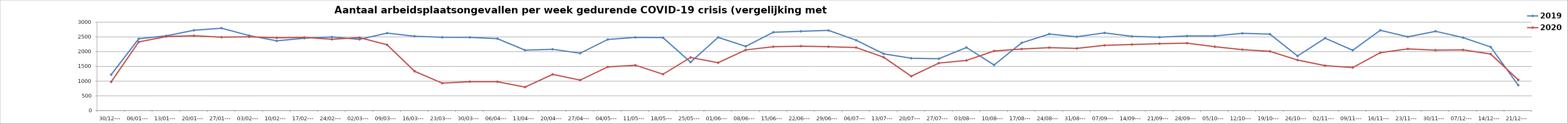
| Category | 2019 | 2020 |
|---|---|---|
| 30/12--- | 1219 | 976 |
| 06/01--- | 2438 | 2330 |
| 13/01--- | 2537 | 2512 |
| 20/01--- | 2725 | 2541 |
| 27/01--- | 2798 | 2492 |
| 03/02--- | 2547 | 2506 |
| 10/02--- | 2366 | 2472 |
| 17/02--- | 2457 | 2483 |
| 24/02--- | 2498 | 2420 |
| 02/03--- | 2418 | 2476 |
| 09/03--- | 2629 | 2234 |
| 16/03--- | 2525 | 1334 |
| 23/03--- | 2487 | 930 |
| 30/03--- | 2486 | 982 |
| 06/04--- | 2442 | 980 |
| 13/04--- | 2051 | 798 |
| 20/04--- | 2081 | 1229 |
| 27/04--- | 1947 | 1034 |
| 04/05--- | 2414 | 1482 |
| 11/05--- | 2485 | 1540 |
| 18/05--- | 2477 | 1234 |
| 25/05--- | 1644 | 1802 |
| 01/06--- | 2485 | 1625 |
| 08/06--- | 2180 | 2060 |
| 15/06--- | 2659 | 2169 |
| 22/06--- | 2692 | 2187 |
| 29/06--- | 2721 | 2168 |
| 06/07--- | 2390 | 2141 |
| 13/07--- | 1927 | 1810 |
| 20/07--- | 1777 | 1167 |
| 27/07--- | 1760 | 1612 |
| 03/08--- | 2142 | 1701 |
| 10/08--- | 1548 | 2023 |
| 17/08--- | 2299 | 2091 |
| 24/08--- | 2598 | 2138 |
| 31/08--- | 2506 | 2110 |
| 07/09--- | 2637 | 2213 |
| 14/09--- | 2519 | 2243 |
| 21/09--- | 2492 | 2271 |
| 28/09--- | 2533 | 2289 |
| 05/10--- | 2534 | 2168 |
| 12/10--- | 2622 | 2070 |
| 19/10--- | 2595 | 2012 |
| 26/10--- | 1852 | 1716 |
| 02/11--- | 2458 | 1524 |
| 09/11--- | 2048 | 1461 |
| 16/11--- | 2725 | 1967 |
| 23/11--- | 2504 | 2094 |
| 30/11--- | 2692 | 2052 |
| 07/12--- | 2477 | 2061 |
| 14/12--- | 2159 | 1919 |
| 21/12--- | 862 | 1043 |